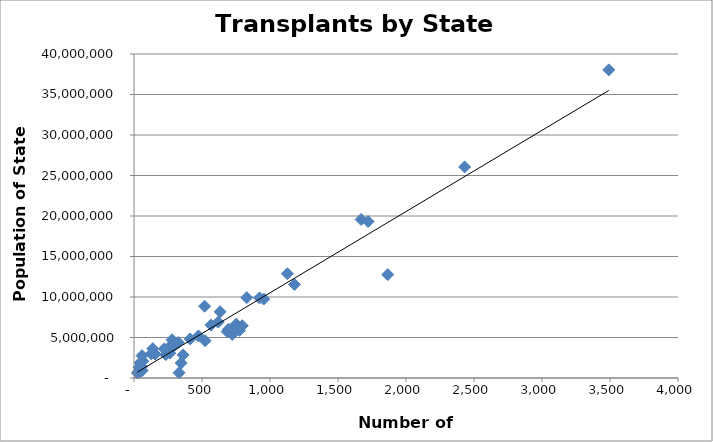
| Category | Population 2012 |
|---|---|
| 331.0 | 646449 |
| 347.0 | 1855525 |
| 1866.0 | 12763536 |
| 722.0 | 5379139 |
| 776.0 | 5884563 |
| 361.0 | 2855287 |
| 796.0 | 6456243 |
| 685.0 | 5726398 |
| 695.0 | 6021988 |
| 754.0 | 6553255 |
| 523.0 | 4601893 |
| 752.0 | 6646144 |
| 1180.0 | 11544225 |
| 954.0 | 9752073 |
| 923.0 | 9883360 |
| 2431.0 | 26059203 |
| 3491.0 | 38041430 |
| 474.0 | 5187582 |
| 619.0 | 6897012 |
| 1721.0 | 19317568 |
| 1128.0 | 12875255 |
| 566.0 | 6537334 |
| 413.0 | 4822023 |
| 263.0 | 3074186 |
| 1670.0 | 19570261 |
| 829.0 | 9919945 |
| 233.0 | 2885905 |
| 633.0 | 8185867 |
| 326.0 | 4380415 |
| 290.0 | 3899353 |
| 260.0 | 3814820 |
| 60.0 | 917092 |
| 223.0 | 3590347 |
| 280.0 | 4723723 |
| 519.0 | 8864590 |
| 38.0 | 699628 |
| 156.0 | 2949131 |
| 126.0 | 2984926 |
| 35.0 | 833354 |
| 56.0 | 1392313 |
| 42.0 | 1050292 |
| 25.0 | 626011 |
| 138.0 | 3615000 |
| 65.0 | 2085538 |
| 39.0 | 1320718 |
| 38.0 | 1329192 |
| 43.0 | 1855413 |
| 59.0 | 2758931 |